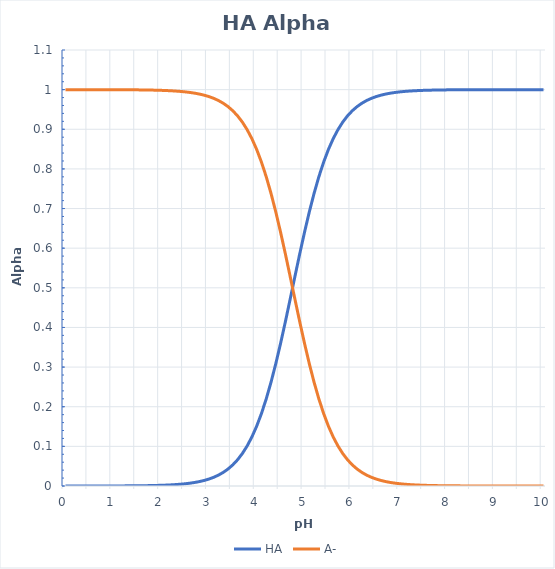
| Category | HA | A- |
|---|---|---|
| 0.0 | 0 | 1 |
| 0.1 | 0 | 1 |
| 0.2 | 0 | 1 |
| 0.30000000000000004 | 0 | 1 |
| 0.4 | 0 | 1 |
| 0.5 | 0 | 1 |
| 0.6 | 0 | 1 |
| 0.7 | 0 | 1 |
| 0.7999999999999999 | 0 | 1 |
| 0.8999999999999999 | 0 | 1 |
| 0.9999999999999999 | 0 | 1 |
| 1.0999999999999999 | 0 | 1 |
| 1.2 | 0 | 1 |
| 1.3 | 0 | 1 |
| 1.4000000000000001 | 0 | 1 |
| 1.5000000000000002 | 0.001 | 0.999 |
| 1.6000000000000003 | 0.001 | 0.999 |
| 1.7000000000000004 | 0.001 | 0.999 |
| 1.8000000000000005 | 0.001 | 0.999 |
| 1.9000000000000006 | 0.001 | 0.999 |
| 2.0000000000000004 | 0.002 | 0.998 |
| 2.1000000000000005 | 0.002 | 0.998 |
| 2.2000000000000006 | 0.003 | 0.997 |
| 2.3000000000000007 | 0.004 | 0.996 |
| 2.400000000000001 | 0.004 | 0.996 |
| 2.500000000000001 | 0.006 | 0.994 |
| 2.600000000000001 | 0.007 | 0.993 |
| 2.700000000000001 | 0.009 | 0.991 |
| 2.800000000000001 | 0.011 | 0.989 |
| 2.9000000000000012 | 0.014 | 0.986 |
| 3.0000000000000013 | 0.017 | 0.983 |
| 3.1000000000000014 | 0.022 | 0.978 |
| 3.2000000000000015 | 0.027 | 0.973 |
| 3.3000000000000016 | 0.034 | 0.966 |
| 3.4000000000000017 | 0.043 | 0.957 |
| 3.5000000000000018 | 0.053 | 0.947 |
| 3.600000000000002 | 0.066 | 0.934 |
| 3.700000000000002 | 0.082 | 0.918 |
| 3.800000000000002 | 0.101 | 0.899 |
| 3.900000000000002 | 0.124 | 0.876 |
| 4.000000000000002 | 0.151 | 0.849 |
| 4.100000000000001 | 0.183 | 0.817 |
| 4.200000000000001 | 0.22 | 0.78 |
| 4.300000000000001 | 0.262 | 0.738 |
| 4.4 | 0.309 | 0.691 |
| 4.5 | 0.36 | 0.64 |
| 4.6 | 0.415 | 0.585 |
| 4.699999999999999 | 0.471 | 0.529 |
| 4.799999999999999 | 0.529 | 0.471 |
| 4.899999999999999 | 0.585 | 0.415 |
| 4.999999999999998 | 0.64 | 0.36 |
| 5.099999999999998 | 0.691 | 0.309 |
| 5.1999999999999975 | 0.738 | 0.262 |
| 5.299999999999997 | 0.78 | 0.22 |
| 5.399999999999997 | 0.817 | 0.183 |
| 5.4999999999999964 | 0.849 | 0.151 |
| 5.599999999999996 | 0.876 | 0.124 |
| 5.699999999999996 | 0.899 | 0.101 |
| 5.799999999999995 | 0.918 | 0.082 |
| 5.899999999999995 | 0.934 | 0.066 |
| 5.999999999999995 | 0.947 | 0.053 |
| 6.099999999999994 | 0.957 | 0.043 |
| 6.199999999999994 | 0.966 | 0.034 |
| 6.299999999999994 | 0.973 | 0.027 |
| 6.399999999999993 | 0.978 | 0.022 |
| 6.499999999999993 | 0.983 | 0.017 |
| 6.5999999999999925 | 0.986 | 0.014 |
| 6.699999999999992 | 0.989 | 0.011 |
| 6.799999999999992 | 0.991 | 0.009 |
| 6.8999999999999915 | 0.993 | 0.007 |
| 6.999999999999991 | 0.994 | 0.006 |
| 7.099999999999991 | 0.996 | 0.004 |
| 7.19999999999999 | 0.996 | 0.004 |
| 7.29999999999999 | 0.997 | 0.003 |
| 7.39999999999999 | 0.998 | 0.002 |
| 7.499999999999989 | 0.998 | 0.002 |
| 7.599999999999989 | 0.999 | 0.001 |
| 7.699999999999989 | 0.999 | 0.001 |
| 7.799999999999988 | 0.999 | 0.001 |
| 7.899999999999988 | 0.999 | 0.001 |
| 7.999999999999988 | 0.999 | 0.001 |
| 8.099999999999987 | 1 | 0 |
| 8.199999999999987 | 1 | 0 |
| 8.299999999999986 | 1 | 0 |
| 8.399999999999986 | 1 | 0 |
| 8.499999999999986 | 1 | 0 |
| 8.599999999999985 | 1 | 0 |
| 8.699999999999985 | 1 | 0 |
| 8.799999999999985 | 1 | 0 |
| 8.899999999999984 | 1 | 0 |
| 8.999999999999984 | 1 | 0 |
| 9.099999999999984 | 1 | 0 |
| 9.199999999999983 | 1 | 0 |
| 9.299999999999983 | 1 | 0 |
| 9.399999999999983 | 1 | 0 |
| 9.499999999999982 | 1 | 0 |
| 9.599999999999982 | 1 | 0 |
| 9.699999999999982 | 1 | 0 |
| 9.799999999999981 | 1 | 0 |
| 9.89999999999998 | 1 | 0 |
| 9.99999999999998 | 1 | 0 |